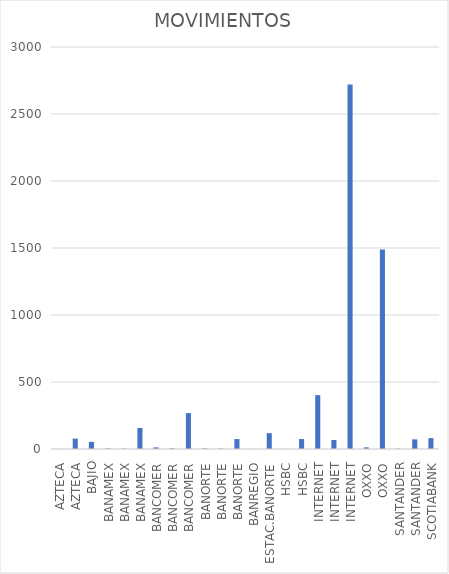
| Category | MOVIMIENTOS |
|---|---|
| AZTECA | 1 |
| AZTECA | 77 |
| BAJIO | 53 |
| BANAMEX | 4 |
| BANAMEX | 2 |
| BANAMEX | 157 |
| BANCOMER | 12 |
| BANCOMER | 5 |
| BANCOMER | 268 |
| BANORTE | 4 |
| BANORTE | 3 |
| BANORTE | 74 |
| BANREGIO | 1 |
| ESTAC.BANORTE | 118 |
| HSBC | 1 |
| HSBC | 74 |
| INTERNET | 402 |
| INTERNET | 67 |
| INTERNET | 2720 |
| OXXO | 12 |
| OXXO | 1488 |
| SANTANDER | 2 |
| SANTANDER | 72 |
| SCOTIABANK | 81 |